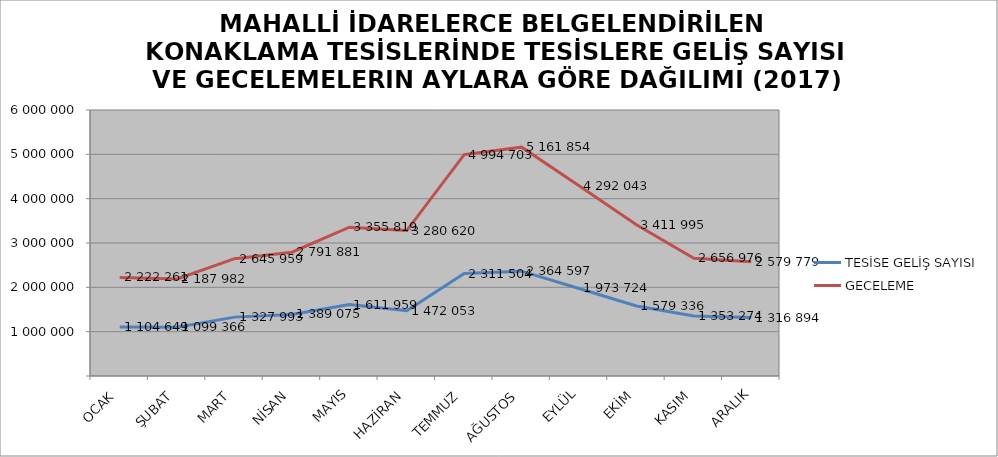
| Category | TESİSE GELİŞ SAYISI | GECELEME |
|---|---|---|
| OCAK | 1104649 | 2222261 |
| ŞUBAT | 1099366 | 2187982 |
| MART | 1327993 | 2645959 |
| NİSAN | 1389075 | 2791881 |
| MAYIS | 1611959 | 3355819 |
| HAZİRAN | 1472053 | 3280620 |
| TEMMUZ | 2311504 | 4994703 |
| AĞUSTOS | 2364597 | 5161854 |
| EYLÜL | 1973724 | 4292043 |
| EKİM | 1579336 | 3411995 |
| KASIM | 1353274 | 2656976 |
| ARALIK | 1316894 | 2579779 |